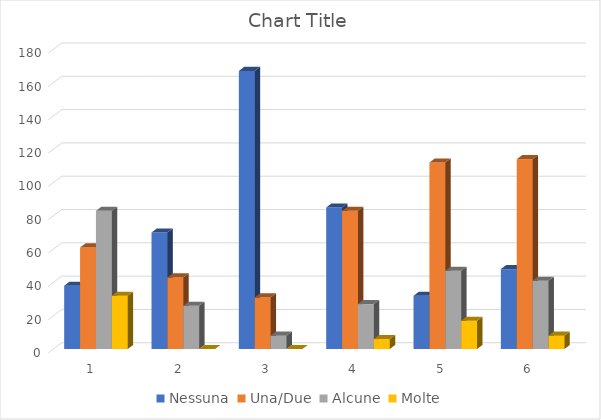
| Category | Nessuna | Una/Due | Alcune | Molte |
|---|---|---|---|---|
| 0 | 38 | 61 | 83 | 32 |
| 1 | 70 | 43 | 26 | 0 |
| 2 | 167 | 31 | 8 | 0 |
| 3 | 85 | 83 | 27 | 6 |
| 4 | 32 | 112 | 47 | 17 |
| 5 | 48 | 114 | 41 | 8 |